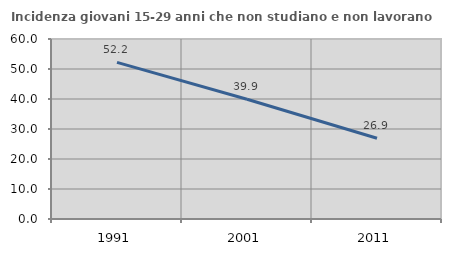
| Category | Incidenza giovani 15-29 anni che non studiano e non lavorano  |
|---|---|
| 1991.0 | 52.198 |
| 2001.0 | 39.903 |
| 2011.0 | 26.912 |